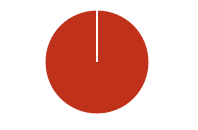
| Category | Total |
|---|---|
| Y | 0 |
| R | 0 |
| T | 0 |
| M | 0 |
| F | 0 |
| N | 2658 |